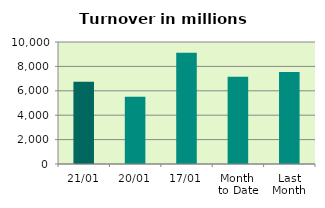
| Category | Series 0 |
|---|---|
| 21/01 | 6737.97 |
| 20/01 | 5519.447 |
| 17/01 | 9127.898 |
| Month 
to Date | 7151.535 |
| Last
Month | 7540.813 |